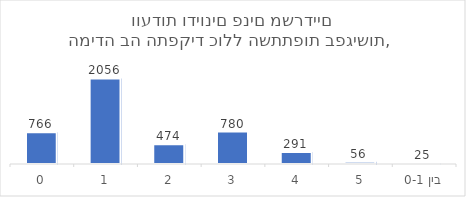
| Category | סה"כ |
|---|---|
| 0 | 766 |
| 1 | 2056 |
| 2 | 474 |
| 3 | 780 |
| 4 | 291 |
| 5 | 56 |
| בין 0-1 | 25 |